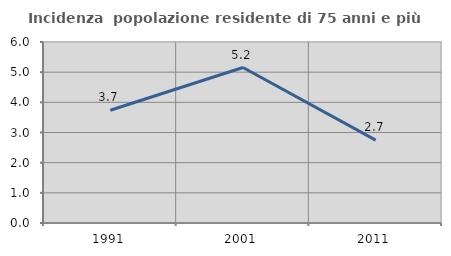
| Category | Incidenza  popolazione residente di 75 anni e più |
|---|---|
| 1991.0 | 3.738 |
| 2001.0 | 5.155 |
| 2011.0 | 2.746 |